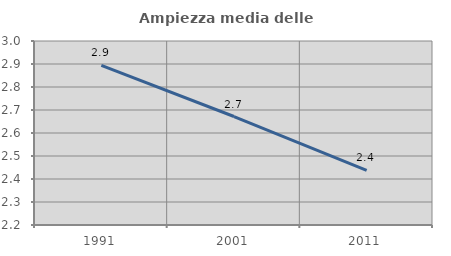
| Category | Ampiezza media delle famiglie |
|---|---|
| 1991.0 | 2.894 |
| 2001.0 | 2.672 |
| 2011.0 | 2.437 |